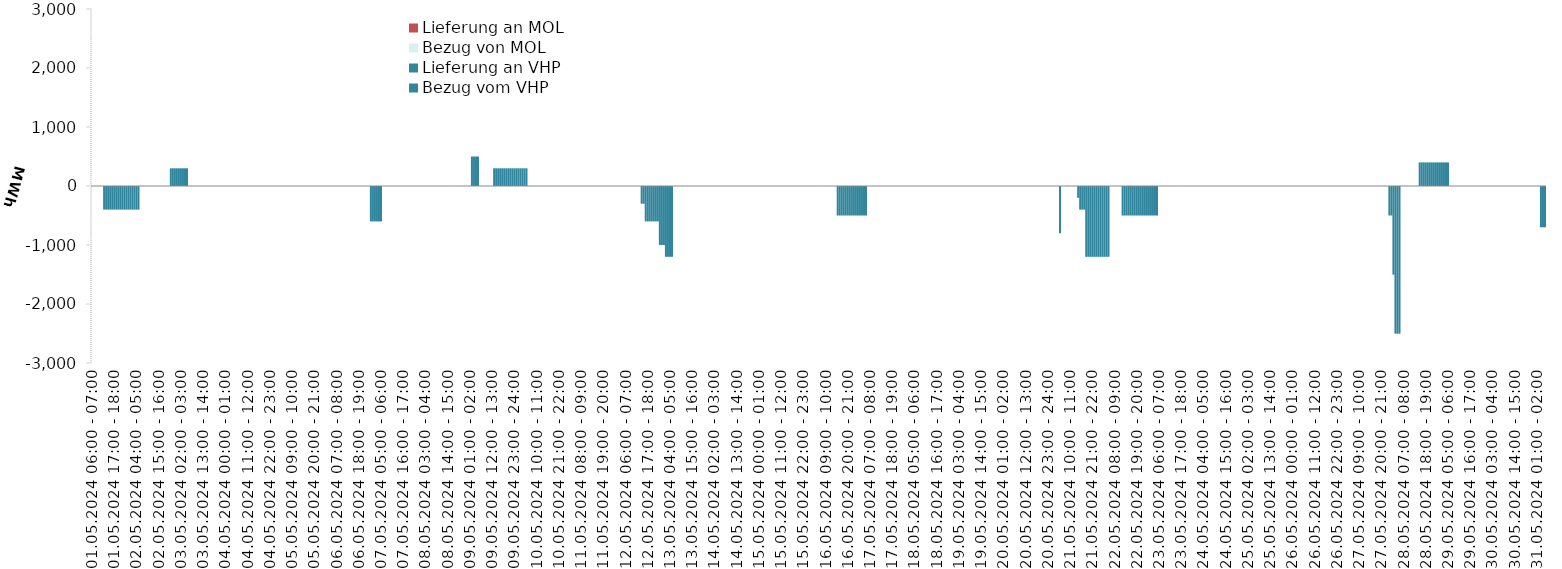
| Category | Bezug vom VHP | Lieferung an VHP | Bezug von MOL | Lieferung an MOL |
|---|---|---|---|---|
| 01.05.2024 06:00 - 07:00 | 0 | 0 | 0 | 0 |
| 01.05.2024 07:00 - 08:00 | 0 | 0 | 0 | 0 |
| 01.05.2024 08:00 - 09:00 | 0 | 0 | 0 | 0 |
| 01.05.2024 09:00 - 10:00 | 0 | 0 | 0 | 0 |
| 01.05.2024 10:00 - 11:00 | 0 | 0 | 0 | 0 |
| 01.05.2024 11:00 - 12:00 | 0 | 0 | 0 | 0 |
| 01.05.2024 12:00 - 13:00 | 0 | -400 | 0 | 0 |
| 01.05.2024 13:00 - 14:00 | 0 | -400 | 0 | 0 |
| 01.05.2024 14:00 - 15:00 | 0 | -400 | 0 | 0 |
| 01.05.2024 15:00 - 16:00 | 0 | -400 | 0 | 0 |
| 01.05.2024 16:00 - 17:00 | 0 | -400 | 0 | 0 |
| 01.05.2024 17:00 - 18:00 | 0 | -400 | 0 | 0 |
| 01.05.2024 18:00 - 19:00 | 0 | -400 | 0 | 0 |
| 01.05.2024 19:00 - 20:00 | 0 | -400 | 0 | 0 |
| 01.05.2024 20:00 - 21:00 | 0 | -400 | 0 | 0 |
| 01.05.2024 21:00 - 22:00 | 0 | -400 | 0 | 0 |
| 01.05.2024 22:00 - 23:00 | 0 | -400 | 0 | 0 |
| 01.05.2024 23:00 - 24:00 | 0 | -400 | 0 | 0 |
| 02.05.2024 00:00 - 01:00 | 0 | -400 | 0 | 0 |
| 02.05.2024 01:00 - 02:00 | 0 | -400 | 0 | 0 |
| 02.05.2024 02:00 - 03:00 | 0 | -400 | 0 | 0 |
| 02.05.2024 03:00 - 04:00 | 0 | -400 | 0 | 0 |
| 02.05.2024 04:00 - 05:00 | 0 | -400 | 0 | 0 |
| 02.05.2024 05:00 - 06:00 | 0 | -400 | 0 | 0 |
| 02.05.2024 06:00 - 07:00 | 0 | 0 | 0 | 0 |
| 02.05.2024 07:00 - 08:00 | 0 | 0 | 0 | 0 |
| 02.05.2024 08:00 - 09:00 | 0 | 0 | 0 | 0 |
| 02.05.2024 09:00 - 10:00 | 0 | 0 | 0 | 0 |
| 02.05.2024 10:00 - 11:00 | 0 | 0 | 0 | 0 |
| 02.05.2024 11:00 - 12:00 | 0 | 0 | 0 | 0 |
| 02.05.2024 12:00 - 13:00 | 0 | 0 | 0 | 0 |
| 02.05.2024 13:00 - 14:00 | 0 | 0 | 0 | 0 |
| 02.05.2024 14:00 - 15:00 | 0 | 0 | 0 | 0 |
| 02.05.2024 15:00 - 16:00 | 0 | 0 | 0 | 0 |
| 02.05.2024 16:00 - 17:00 | 0 | 0 | 0 | 0 |
| 02.05.2024 17:00 - 18:00 | 0 | 0 | 0 | 0 |
| 02.05.2024 18:00 - 19:00 | 0 | 0 | 0 | 0 |
| 02.05.2024 19:00 - 20:00 | 0 | 0 | 0 | 0 |
| 02.05.2024 20:00 - 21:00 | 0 | 0 | 0 | 0 |
| 02.05.2024 21:00 - 22:00 | 300 | 0 | 0 | 0 |
| 02.05.2024 22:00 - 23:00 | 300 | 0 | 0 | 0 |
| 02.05.2024 23:00 - 24:00 | 300 | 0 | 0 | 0 |
| 03.05.2024 00:00 - 01:00 | 300 | 0 | 0 | 0 |
| 03.05.2024 01:00 - 02:00 | 300 | 0 | 0 | 0 |
| 03.05.2024 02:00 - 03:00 | 300 | 0 | 0 | 0 |
| 03.05.2024 03:00 - 04:00 | 300 | 0 | 0 | 0 |
| 03.05.2024 04:00 - 05:00 | 300 | 0 | 0 | 0 |
| 03.05.2024 05:00 - 06:00 | 300 | 0 | 0 | 0 |
| 03.05.2024 06:00 - 07:00 | 0 | 0 | 0 | 0 |
| 03.05.2024 07:00 - 08:00 | 0 | 0 | 0 | 0 |
| 03.05.2024 08:00 - 09:00 | 0 | 0 | 0 | 0 |
| 03.05.2024 09:00 - 10:00 | 0 | 0 | 0 | 0 |
| 03.05.2024 10:00 - 11:00 | 0 | 0 | 0 | 0 |
| 03.05.2024 11:00 - 12:00 | 0 | 0 | 0 | 0 |
| 03.05.2024 12:00 - 13:00 | 0 | 0 | 0 | 0 |
| 03.05.2024 13:00 - 14:00 | 0 | 0 | 0 | 0 |
| 03.05.2024 14:00 - 15:00 | 0 | 0 | 0 | 0 |
| 03.05.2024 15:00 - 16:00 | 0 | 0 | 0 | 0 |
| 03.05.2024 16:00 - 17:00 | 0 | 0 | 0 | 0 |
| 03.05.2024 17:00 - 18:00 | 0 | 0 | 0 | 0 |
| 03.05.2024 18:00 - 19:00 | 0 | 0 | 0 | 0 |
| 03.05.2024 19:00 - 20:00 | 0 | 0 | 0 | 0 |
| 03.05.2024 20:00 - 21:00 | 0 | 0 | 0 | 0 |
| 03.05.2024 21:00 - 22:00 | 0 | 0 | 0 | 0 |
| 03.05.2024 22:00 - 23:00 | 0 | 0 | 0 | 0 |
| 03.05.2024 23:00 - 24:00 | 0 | 0 | 0 | 0 |
| 04.05.2024 00:00 - 01:00 | 0 | 0 | 0 | 0 |
| 04.05.2024 01:00 - 02:00 | 0 | 0 | 0 | 0 |
| 04.05.2024 02:00 - 03:00 | 0 | 0 | 0 | 0 |
| 04.05.2024 03:00 - 04:00 | 0 | 0 | 0 | 0 |
| 04.05.2024 04:00 - 05:00 | 0 | 0 | 0 | 0 |
| 04.05.2024 05:00 - 06:00 | 0 | 0 | 0 | 0 |
| 04.05.2024 06:00 - 07:00 | 0 | 0 | 0 | 0 |
| 04.05.2024 07:00 - 08:00 | 0 | 0 | 0 | 0 |
| 04.05.2024 08:00 - 09:00 | 0 | 0 | 0 | 0 |
| 04.05.2024 09:00 - 10:00 | 0 | 0 | 0 | 0 |
| 04.05.2024 10:00 - 11:00 | 0 | 0 | 0 | 0 |
| 04.05.2024 11:00 - 12:00 | 0 | 0 | 0 | 0 |
| 04.05.2024 12:00 - 13:00 | 0 | 0 | 0 | 0 |
| 04.05.2024 13:00 - 14:00 | 0 | 0 | 0 | 0 |
| 04.05.2024 14:00 - 15:00 | 0 | 0 | 0 | 0 |
| 04.05.2024 15:00 - 16:00 | 0 | 0 | 0 | 0 |
| 04.05.2024 16:00 - 17:00 | 0 | 0 | 0 | 0 |
| 04.05.2024 17:00 - 18:00 | 0 | 0 | 0 | 0 |
| 04.05.2024 18:00 - 19:00 | 0 | 0 | 0 | 0 |
| 04.05.2024 19:00 - 20:00 | 0 | 0 | 0 | 0 |
| 04.05.2024 20:00 - 21:00 | 0 | 0 | 0 | 0 |
| 04.05.2024 21:00 - 22:00 | 0 | 0 | 0 | 0 |
| 04.05.2024 22:00 - 23:00 | 0 | 0 | 0 | 0 |
| 04.05.2024 23:00 - 24:00 | 0 | 0 | 0 | 0 |
| 05.05.2024 00:00 - 01:00 | 0 | 0 | 0 | 0 |
| 05.05.2024 01:00 - 02:00 | 0 | 0 | 0 | 0 |
| 05.05.2024 02:00 - 03:00 | 0 | 0 | 0 | 0 |
| 05.05.2024 03:00 - 04:00 | 0 | 0 | 0 | 0 |
| 05.05.2024 04:00 - 05:00 | 0 | 0 | 0 | 0 |
| 05.05.2024 05:00 - 06:00 | 0 | 0 | 0 | 0 |
| 05.05.2024 06:00 - 07:00 | 0 | 0 | 0 | 0 |
| 05.05.2024 07:00 - 08:00 | 0 | 0 | 0 | 0 |
| 05.05.2024 08:00 - 09:00 | 0 | 0 | 0 | 0 |
| 05.05.2024 09:00 - 10:00 | 0 | 0 | 0 | 0 |
| 05.05.2024 10:00 - 11:00 | 0 | 0 | 0 | 0 |
| 05.05.2024 11:00 - 12:00 | 0 | 0 | 0 | 0 |
| 05.05.2024 12:00 - 13:00 | 0 | 0 | 0 | 0 |
| 05.05.2024 13:00 - 14:00 | 0 | 0 | 0 | 0 |
| 05.05.2024 14:00 - 15:00 | 0 | 0 | 0 | 0 |
| 05.05.2024 15:00 - 16:00 | 0 | 0 | 0 | 0 |
| 05.05.2024 16:00 - 17:00 | 0 | 0 | 0 | 0 |
| 05.05.2024 17:00 - 18:00 | 0 | 0 | 0 | 0 |
| 05.05.2024 18:00 - 19:00 | 0 | 0 | 0 | 0 |
| 05.05.2024 19:00 - 20:00 | 0 | 0 | 0 | 0 |
| 05.05.2024 20:00 - 21:00 | 0 | 0 | 0 | 0 |
| 05.05.2024 21:00 - 22:00 | 0 | 0 | 0 | 0 |
| 05.05.2024 22:00 - 23:00 | 0 | 0 | 0 | 0 |
| 05.05.2024 23:00 - 24:00 | 0 | 0 | 0 | 0 |
| 06.05.2024 00:00 - 01:00 | 0 | 0 | 0 | 0 |
| 06.05.2024 01:00 - 02:00 | 0 | 0 | 0 | 0 |
| 06.05.2024 02:00 - 03:00 | 0 | 0 | 0 | 0 |
| 06.05.2024 03:00 - 04:00 | 0 | 0 | 0 | 0 |
| 06.05.2024 04:00 - 05:00 | 0 | 0 | 0 | 0 |
| 06.05.2024 05:00 - 06:00 | 0 | 0 | 0 | 0 |
| 06.05.2024 06:00 - 07:00 | 0 | 0 | 0 | 0 |
| 06.05.2024 07:00 - 08:00 | 0 | 0 | 0 | 0 |
| 06.05.2024 08:00 - 09:00 | 0 | 0 | 0 | 0 |
| 06.05.2024 09:00 - 10:00 | 0 | 0 | 0 | 0 |
| 06.05.2024 10:00 - 11:00 | 0 | 0 | 0 | 0 |
| 06.05.2024 11:00 - 12:00 | 0 | 0 | 0 | 0 |
| 06.05.2024 12:00 - 13:00 | 0 | 0 | 0 | 0 |
| 06.05.2024 13:00 - 14:00 | 0 | 0 | 0 | 0 |
| 06.05.2024 14:00 - 15:00 | 0 | 0 | 0 | 0 |
| 06.05.2024 15:00 - 16:00 | 0 | 0 | 0 | 0 |
| 06.05.2024 16:00 - 17:00 | 0 | 0 | 0 | 0 |
| 06.05.2024 17:00 - 18:00 | 0 | 0 | 0 | 0 |
| 06.05.2024 18:00 - 19:00 | 0 | 0 | 0 | 0 |
| 06.05.2024 19:00 - 20:00 | 0 | 0 | 0 | 0 |
| 06.05.2024 20:00 - 21:00 | 0 | 0 | 0 | 0 |
| 06.05.2024 21:00 - 22:00 | 0 | 0 | 0 | 0 |
| 06.05.2024 22:00 - 23:00 | 0 | 0 | 0 | 0 |
| 06.05.2024 23:00 - 24:00 | 0 | 0 | 0 | 0 |
| 07.05.2024 00:00 - 01:00 | 0 | -600 | 0 | 0 |
| 07.05.2024 01:00 - 02:00 | 0 | -600 | 0 | 0 |
| 07.05.2024 02:00 - 03:00 | 0 | -600 | 0 | 0 |
| 07.05.2024 03:00 - 04:00 | 0 | -600 | 0 | 0 |
| 07.05.2024 04:00 - 05:00 | 0 | -600 | 0 | 0 |
| 07.05.2024 05:00 - 06:00 | 0 | -600 | 0 | 0 |
| 07.05.2024 06:00 - 07:00 | 0 | 0 | 0 | 0 |
| 07.05.2024 07:00 - 08:00 | 0 | 0 | 0 | 0 |
| 07.05.2024 08:00 - 09:00 | 0 | 0 | 0 | 0 |
| 07.05.2024 09:00 - 10:00 | 0 | 0 | 0 | 0 |
| 07.05.2024 10:00 - 11:00 | 0 | 0 | 0 | 0 |
| 07.05.2024 11:00 - 12:00 | 0 | 0 | 0 | 0 |
| 07.05.2024 12:00 - 13:00 | 0 | 0 | 0 | 0 |
| 07.05.2024 13:00 - 14:00 | 0 | 0 | 0 | 0 |
| 07.05.2024 14:00 - 15:00 | 0 | 0 | 0 | 0 |
| 07.05.2024 15:00 - 16:00 | 0 | 0 | 0 | 0 |
| 07.05.2024 16:00 - 17:00 | 0 | 0 | 0 | 0 |
| 07.05.2024 17:00 - 18:00 | 0 | 0 | 0 | 0 |
| 07.05.2024 18:00 - 19:00 | 0 | 0 | 0 | 0 |
| 07.05.2024 19:00 - 20:00 | 0 | 0 | 0 | 0 |
| 07.05.2024 20:00 - 21:00 | 0 | 0 | 0 | 0 |
| 07.05.2024 21:00 - 22:00 | 0 | 0 | 0 | 0 |
| 07.05.2024 22:00 - 23:00 | 0 | 0 | 0 | 0 |
| 07.05.2024 23:00 - 24:00 | 0 | 0 | 0 | 0 |
| 08.05.2024 00:00 - 01:00 | 0 | 0 | 0 | 0 |
| 08.05.2024 01:00 - 02:00 | 0 | 0 | 0 | 0 |
| 08.05.2024 02:00 - 03:00 | 0 | 0 | 0 | 0 |
| 08.05.2024 03:00 - 04:00 | 0 | 0 | 0 | 0 |
| 08.05.2024 04:00 - 05:00 | 0 | 0 | 0 | 0 |
| 08.05.2024 05:00 - 06:00 | 0 | 0 | 0 | 0 |
| 08.05.2024 06:00 - 07:00 | 0 | 0 | 0 | 0 |
| 08.05.2024 07:00 - 08:00 | 0 | 0 | 0 | 0 |
| 08.05.2024 08:00 - 09:00 | 0 | 0 | 0 | 0 |
| 08.05.2024 09:00 - 10:00 | 0 | 0 | 0 | 0 |
| 08.05.2024 10:00 - 11:00 | 0 | 0 | 0 | 0 |
| 08.05.2024 11:00 - 12:00 | 0 | 0 | 0 | 0 |
| 08.05.2024 12:00 - 13:00 | 0 | 0 | 0 | 0 |
| 08.05.2024 13:00 - 14:00 | 0 | 0 | 0 | 0 |
| 08.05.2024 14:00 - 15:00 | 0 | 0 | 0 | 0 |
| 08.05.2024 15:00 - 16:00 | 0 | 0 | 0 | 0 |
| 08.05.2024 16:00 - 17:00 | 0 | 0 | 0 | 0 |
| 08.05.2024 17:00 - 18:00 | 0 | 0 | 0 | 0 |
| 08.05.2024 18:00 - 19:00 | 0 | 0 | 0 | 0 |
| 08.05.2024 19:00 - 20:00 | 0 | 0 | 0 | 0 |
| 08.05.2024 20:00 - 21:00 | 0 | 0 | 0 | 0 |
| 08.05.2024 21:00 - 22:00 | 0 | 0 | 0 | 0 |
| 08.05.2024 22:00 - 23:00 | 0 | 0 | 0 | 0 |
| 08.05.2024 23:00 - 24:00 | 0 | 0 | 0 | 0 |
| 09.05.2024 00:00 - 01:00 | 0 | 0 | 0 | 0 |
| 09.05.2024 01:00 - 02:00 | 0 | 0 | 0 | 0 |
| 09.05.2024 02:00 - 03:00 | 500 | 0 | 0 | 0 |
| 09.05.2024 03:00 - 04:00 | 500 | 0 | 0 | 0 |
| 09.05.2024 04:00 - 05:00 | 500 | 0 | 0 | 0 |
| 09.05.2024 05:00 - 06:00 | 500 | 0 | 0 | 0 |
| 09.05.2024 06:00 - 07:00 | 0 | 0 | 0 | 0 |
| 09.05.2024 07:00 - 08:00 | 0 | 0 | 0 | 0 |
| 09.05.2024 08:00 - 09:00 | 0 | 0 | 0 | 0 |
| 09.05.2024 09:00 - 10:00 | 0 | 0 | 0 | 0 |
| 09.05.2024 10:00 - 11:00 | 0 | 0 | 0 | 0 |
| 09.05.2024 11:00 - 12:00 | 0 | 0 | 0 | 0 |
| 09.05.2024 12:00 - 13:00 | 0 | 0 | 0 | 0 |
| 09.05.2024 13:00 - 14:00 | 300 | 0 | 0 | 0 |
| 09.05.2024 14:00 - 15:00 | 300 | 0 | 0 | 0 |
| 09.05.2024 15:00 - 16:00 | 300 | 0 | 0 | 0 |
| 09.05.2024 16:00 - 17:00 | 300 | 0 | 0 | 0 |
| 09.05.2024 17:00 - 18:00 | 300 | 0 | 0 | 0 |
| 09.05.2024 18:00 - 19:00 | 300 | 0 | 0 | 0 |
| 09.05.2024 19:00 - 20:00 | 300 | 0 | 0 | 0 |
| 09.05.2024 20:00 - 21:00 | 300 | 0 | 0 | 0 |
| 09.05.2024 21:00 - 22:00 | 300 | 0 | 0 | 0 |
| 09.05.2024 22:00 - 23:00 | 300 | 0 | 0 | 0 |
| 09.05.2024 23:00 - 24:00 | 300 | 0 | 0 | 0 |
| 10.05.2024 00:00 - 01:00 | 300 | 0 | 0 | 0 |
| 10.05.2024 01:00 - 02:00 | 300 | 0 | 0 | 0 |
| 10.05.2024 02:00 - 03:00 | 300 | 0 | 0 | 0 |
| 10.05.2024 03:00 - 04:00 | 300 | 0 | 0 | 0 |
| 10.05.2024 04:00 - 05:00 | 300 | 0 | 0 | 0 |
| 10.05.2024 05:00 - 06:00 | 300 | 0 | 0 | 0 |
| 10.05.2024 06:00 - 07:00 | 0 | 0 | 0 | 0 |
| 10.05.2024 07:00 - 08:00 | 0 | 0 | 0 | 0 |
| 10.05.2024 08:00 - 09:00 | 0 | 0 | 0 | 0 |
| 10.05.2024 09:00 - 10:00 | 0 | 0 | 0 | 0 |
| 10.05.2024 10:00 - 11:00 | 0 | 0 | 0 | 0 |
| 10.05.2024 11:00 - 12:00 | 0 | 0 | 0 | 0 |
| 10.05.2024 12:00 - 13:00 | 0 | 0 | 0 | 0 |
| 10.05.2024 13:00 - 14:00 | 0 | 0 | 0 | 0 |
| 10.05.2024 14:00 - 15:00 | 0 | 0 | 0 | 0 |
| 10.05.2024 15:00 - 16:00 | 0 | 0 | 0 | 0 |
| 10.05.2024 16:00 - 17:00 | 0 | 0 | 0 | 0 |
| 10.05.2024 17:00 - 18:00 | 0 | 0 | 0 | 0 |
| 10.05.2024 18:00 - 19:00 | 0 | 0 | 0 | 0 |
| 10.05.2024 19:00 - 20:00 | 0 | 0 | 0 | 0 |
| 10.05.2024 20:00 - 21:00 | 0 | 0 | 0 | 0 |
| 10.05.2024 21:00 - 22:00 | 0 | 0 | 0 | 0 |
| 10.05.2024 22:00 - 23:00 | 0 | 0 | 0 | 0 |
| 10.05.2024 23:00 - 24:00 | 0 | 0 | 0 | 0 |
| 11.05.2024 00:00 - 01:00 | 0 | 0 | 0 | 0 |
| 11.05.2024 01:00 - 02:00 | 0 | 0 | 0 | 0 |
| 11.05.2024 02:00 - 03:00 | 0 | 0 | 0 | 0 |
| 11.05.2024 03:00 - 04:00 | 0 | 0 | 0 | 0 |
| 11.05.2024 04:00 - 05:00 | 0 | 0 | 0 | 0 |
| 11.05.2024 05:00 - 06:00 | 0 | 0 | 0 | 0 |
| 11.05.2024 06:00 - 07:00 | 0 | 0 | 0 | 0 |
| 11.05.2024 07:00 - 08:00 | 0 | 0 | 0 | 0 |
| 11.05.2024 08:00 - 09:00 | 0 | 0 | 0 | 0 |
| 11.05.2024 09:00 - 10:00 | 0 | 0 | 0 | 0 |
| 11.05.2024 10:00 - 11:00 | 0 | 0 | 0 | 0 |
| 11.05.2024 11:00 - 12:00 | 0 | 0 | 0 | 0 |
| 11.05.2024 12:00 - 13:00 | 0 | 0 | 0 | 0 |
| 11.05.2024 13:00 - 14:00 | 0 | 0 | 0 | 0 |
| 11.05.2024 14:00 - 15:00 | 0 | 0 | 0 | 0 |
| 11.05.2024 15:00 - 16:00 | 0 | 0 | 0 | 0 |
| 11.05.2024 16:00 - 17:00 | 0 | 0 | 0 | 0 |
| 11.05.2024 17:00 - 18:00 | 0 | 0 | 0 | 0 |
| 11.05.2024 18:00 - 19:00 | 0 | 0 | 0 | 0 |
| 11.05.2024 19:00 - 20:00 | 0 | 0 | 0 | 0 |
| 11.05.2024 20:00 - 21:00 | 0 | 0 | 0 | 0 |
| 11.05.2024 21:00 - 22:00 | 0 | 0 | 0 | 0 |
| 11.05.2024 22:00 - 23:00 | 0 | 0 | 0 | 0 |
| 11.05.2024 23:00 - 24:00 | 0 | 0 | 0 | 0 |
| 12.05.2024 00:00 - 01:00 | 0 | 0 | 0 | 0 |
| 12.05.2024 01:00 - 02:00 | 0 | 0 | 0 | 0 |
| 12.05.2024 02:00 - 03:00 | 0 | 0 | 0 | 0 |
| 12.05.2024 03:00 - 04:00 | 0 | 0 | 0 | 0 |
| 12.05.2024 04:00 - 05:00 | 0 | 0 | 0 | 0 |
| 12.05.2024 05:00 - 06:00 | 0 | 0 | 0 | 0 |
| 12.05.2024 06:00 - 07:00 | 0 | 0 | 0 | 0 |
| 12.05.2024 07:00 - 08:00 | 0 | 0 | 0 | 0 |
| 12.05.2024 08:00 - 09:00 | 0 | 0 | 0 | 0 |
| 12.05.2024 09:00 - 10:00 | 0 | 0 | 0 | 0 |
| 12.05.2024 10:00 - 11:00 | 0 | 0 | 0 | 0 |
| 12.05.2024 11:00 - 12:00 | 0 | 0 | 0 | 0 |
| 12.05.2024 12:00 - 13:00 | 0 | 0 | 0 | 0 |
| 12.05.2024 13:00 - 14:00 | 0 | 0 | 0 | 0 |
| 12.05.2024 14:00 - 15:00 | 0 | -300 | 0 | 0 |
| 12.05.2024 15:00 - 16:00 | 0 | -300 | 0 | 0 |
| 12.05.2024 16:00 - 17:00 | 0 | -600 | 0 | 0 |
| 12.05.2024 17:00 - 18:00 | 0 | -600 | 0 | 0 |
| 12.05.2024 18:00 - 19:00 | 0 | -600 | 0 | 0 |
| 12.05.2024 19:00 - 20:00 | 0 | -600 | 0 | 0 |
| 12.05.2024 20:00 - 21:00 | 0 | -600 | 0 | 0 |
| 12.05.2024 21:00 - 22:00 | 0 | -600 | 0 | 0 |
| 12.05.2024 22:00 - 23:00 | 0 | -600 | 0 | 0 |
| 12.05.2024 23:00 - 24:00 | 0 | -1000 | 0 | 0 |
| 13.05.2024 00:00 - 01:00 | 0 | -1000 | 0 | 0 |
| 13.05.2024 01:00 - 02:00 | 0 | -1000 | 0 | 0 |
| 13.05.2024 02:00 - 03:00 | 0 | -1200 | 0 | 0 |
| 13.05.2024 03:00 - 04:00 | 0 | -1200 | 0 | 0 |
| 13.05.2024 04:00 - 05:00 | 0 | -1200 | 0 | 0 |
| 13.05.2024 05:00 - 06:00 | 0 | -1200 | 0 | 0 |
| 13.05.2024 06:00 - 07:00 | 0 | 0 | 0 | 0 |
| 13.05.2024 07:00 - 08:00 | 0 | 0 | 0 | 0 |
| 13.05.2024 08:00 - 09:00 | 0 | 0 | 0 | 0 |
| 13.05.2024 09:00 - 10:00 | 0 | 0 | 0 | 0 |
| 13.05.2024 10:00 - 11:00 | 0 | 0 | 0 | 0 |
| 13.05.2024 11:00 - 12:00 | 0 | 0 | 0 | 0 |
| 13.05.2024 12:00 - 13:00 | 0 | 0 | 0 | 0 |
| 13.05.2024 13:00 - 14:00 | 0 | 0 | 0 | 0 |
| 13.05.2024 14:00 - 15:00 | 0 | 0 | 0 | 0 |
| 13.05.2024 15:00 - 16:00 | 0 | 0 | 0 | 0 |
| 13.05.2024 16:00 - 17:00 | 0 | 0 | 0 | 0 |
| 13.05.2024 17:00 - 18:00 | 0 | 0 | 0 | 0 |
| 13.05.2024 18:00 - 19:00 | 0 | 0 | 0 | 0 |
| 13.05.2024 19:00 - 20:00 | 0 | 0 | 0 | 0 |
| 13.05.2024 20:00 - 21:00 | 0 | 0 | 0 | 0 |
| 13.05.2024 21:00 - 22:00 | 0 | 0 | 0 | 0 |
| 13.05.2024 22:00 - 23:00 | 0 | 0 | 0 | 0 |
| 13.05.2024 23:00 - 24:00 | 0 | 0 | 0 | 0 |
| 14.05.2024 00:00 - 01:00 | 0 | 0 | 0 | 0 |
| 14.05.2024 01:00 - 02:00 | 0 | 0 | 0 | 0 |
| 14.05.2024 02:00 - 03:00 | 0 | 0 | 0 | 0 |
| 14.05.2024 03:00 - 04:00 | 0 | 0 | 0 | 0 |
| 14.05.2024 04:00 - 05:00 | 0 | 0 | 0 | 0 |
| 14.05.2024 05:00 - 06:00 | 0 | 0 | 0 | 0 |
| 14.05.2024 06:00 - 07:00 | 0 | 0 | 0 | 0 |
| 14.05.2024 07:00 - 08:00 | 0 | 0 | 0 | 0 |
| 14.05.2024 08:00 - 09:00 | 0 | 0 | 0 | 0 |
| 14.05.2024 09:00 - 10:00 | 0 | 0 | 0 | 0 |
| 14.05.2024 10:00 - 11:00 | 0 | 0 | 0 | 0 |
| 14.05.2024 11:00 - 12:00 | 0 | 0 | 0 | 0 |
| 14.05.2024 12:00 - 13:00 | 0 | 0 | 0 | 0 |
| 14.05.2024 13:00 - 14:00 | 0 | 0 | 0 | 0 |
| 14.05.2024 14:00 - 15:00 | 0 | 0 | 0 | 0 |
| 14.05.2024 15:00 - 16:00 | 0 | 0 | 0 | 0 |
| 14.05.2024 16:00 - 17:00 | 0 | 0 | 0 | 0 |
| 14.05.2024 17:00 - 18:00 | 0 | 0 | 0 | 0 |
| 14.05.2024 18:00 - 19:00 | 0 | 0 | 0 | 0 |
| 14.05.2024 19:00 - 20:00 | 0 | 0 | 0 | 0 |
| 14.05.2024 20:00 - 21:00 | 0 | 0 | 0 | 0 |
| 14.05.2024 21:00 - 22:00 | 0 | 0 | 0 | 0 |
| 14.05.2024 22:00 - 23:00 | 0 | 0 | 0 | 0 |
| 14.05.2024 23:00 - 24:00 | 0 | 0 | 0 | 0 |
| 15.05.2024 00:00 - 01:00 | 0 | 0 | 0 | 0 |
| 15.05.2024 01:00 - 02:00 | 0 | 0 | 0 | 0 |
| 15.05.2024 02:00 - 03:00 | 0 | 0 | 0 | 0 |
| 15.05.2024 03:00 - 04:00 | 0 | 0 | 0 | 0 |
| 15.05.2024 04:00 - 05:00 | 0 | 0 | 0 | 0 |
| 15.05.2024 05:00 - 06:00 | 0 | 0 | 0 | 0 |
| 15.05.2024 06:00 - 07:00 | 0 | 0 | 0 | 0 |
| 15.05.2024 07:00 - 08:00 | 0 | 0 | 0 | 0 |
| 15.05.2024 08:00 - 09:00 | 0 | 0 | 0 | 0 |
| 15.05.2024 09:00 - 10:00 | 0 | 0 | 0 | 0 |
| 15.05.2024 10:00 - 11:00 | 0 | 0 | 0 | 0 |
| 15.05.2024 11:00 - 12:00 | 0 | 0 | 0 | 0 |
| 15.05.2024 12:00 - 13:00 | 0 | 0 | 0 | 0 |
| 15.05.2024 13:00 - 14:00 | 0 | 0 | 0 | 0 |
| 15.05.2024 14:00 - 15:00 | 0 | 0 | 0 | 0 |
| 15.05.2024 15:00 - 16:00 | 0 | 0 | 0 | 0 |
| 15.05.2024 16:00 - 17:00 | 0 | 0 | 0 | 0 |
| 15.05.2024 17:00 - 18:00 | 0 | 0 | 0 | 0 |
| 15.05.2024 18:00 - 19:00 | 0 | 0 | 0 | 0 |
| 15.05.2024 19:00 - 20:00 | 0 | 0 | 0 | 0 |
| 15.05.2024 20:00 - 21:00 | 0 | 0 | 0 | 0 |
| 15.05.2024 21:00 - 22:00 | 0 | 0 | 0 | 0 |
| 15.05.2024 22:00 - 23:00 | 0 | 0 | 0 | 0 |
| 15.05.2024 23:00 - 24:00 | 0 | 0 | 0 | 0 |
| 16.05.2024 00:00 - 01:00 | 0 | 0 | 0 | 0 |
| 16.05.2024 01:00 - 02:00 | 0 | 0 | 0 | 0 |
| 16.05.2024 02:00 - 03:00 | 0 | 0 | 0 | 0 |
| 16.05.2024 03:00 - 04:00 | 0 | 0 | 0 | 0 |
| 16.05.2024 04:00 - 05:00 | 0 | 0 | 0 | 0 |
| 16.05.2024 05:00 - 06:00 | 0 | 0 | 0 | 0 |
| 16.05.2024 06:00 - 07:00 | 0 | 0 | 0 | 0 |
| 16.05.2024 07:00 - 08:00 | 0 | 0 | 0 | 0 |
| 16.05.2024 08:00 - 09:00 | 0 | 0 | 0 | 0 |
| 16.05.2024 09:00 - 10:00 | 0 | 0 | 0 | 0 |
| 16.05.2024 10:00 - 11:00 | 0 | 0 | 0 | 0 |
| 16.05.2024 11:00 - 12:00 | 0 | 0 | 0 | 0 |
| 16.05.2024 12:00 - 13:00 | 0 | 0 | 0 | 0 |
| 16.05.2024 13:00 - 14:00 | 0 | 0 | 0 | 0 |
| 16.05.2024 14:00 - 15:00 | 0 | 0 | 0 | 0 |
| 16.05.2024 15:00 - 16:00 | 0 | -500 | 0 | 0 |
| 16.05.2024 16:00 - 17:00 | 0 | -500 | 0 | 0 |
| 16.05.2024 17:00 - 18:00 | 0 | -500 | 0 | 0 |
| 16.05.2024 18:00 - 19:00 | 0 | -500 | 0 | 0 |
| 16.05.2024 19:00 - 20:00 | 0 | -500 | 0 | 0 |
| 16.05.2024 20:00 - 21:00 | 0 | -500 | 0 | 0 |
| 16.05.2024 21:00 - 22:00 | 0 | -500 | 0 | 0 |
| 16.05.2024 22:00 - 23:00 | 0 | -500 | 0 | 0 |
| 16.05.2024 23:00 - 24:00 | 0 | -500 | 0 | 0 |
| 17.05.2024 00:00 - 01:00 | 0 | -500 | 0 | 0 |
| 17.05.2024 01:00 - 02:00 | 0 | -500 | 0 | 0 |
| 17.05.2024 02:00 - 03:00 | 0 | -500 | 0 | 0 |
| 17.05.2024 03:00 - 04:00 | 0 | -500 | 0 | 0 |
| 17.05.2024 04:00 - 05:00 | 0 | -500 | 0 | 0 |
| 17.05.2024 05:00 - 06:00 | 0 | -500 | 0 | 0 |
| 17.05.2024 06:00 - 07:00 | 0 | 0 | 0 | 0 |
| 17.05.2024 07:00 - 08:00 | 0 | 0 | 0 | 0 |
| 17.05.2024 08:00 - 09:00 | 0 | 0 | 0 | 0 |
| 17.05.2024 09:00 - 10:00 | 0 | 0 | 0 | 0 |
| 17.05.2024 10:00 - 11:00 | 0 | 0 | 0 | 0 |
| 17.05.2024 11:00 - 12:00 | 0 | 0 | 0 | 0 |
| 17.05.2024 12:00 - 13:00 | 0 | 0 | 0 | 0 |
| 17.05.2024 13:00 - 14:00 | 0 | 0 | 0 | 0 |
| 17.05.2024 14:00 - 15:00 | 0 | 0 | 0 | 0 |
| 17.05.2024 15:00 - 16:00 | 0 | 0 | 0 | 0 |
| 17.05.2024 16:00 - 17:00 | 0 | 0 | 0 | 0 |
| 17.05.2024 17:00 - 18:00 | 0 | 0 | 0 | 0 |
| 17.05.2024 18:00 - 19:00 | 0 | 0 | 0 | 0 |
| 17.05.2024 19:00 - 20:00 | 0 | 0 | 0 | 0 |
| 17.05.2024 20:00 - 21:00 | 0 | 0 | 0 | 0 |
| 17.05.2024 21:00 - 22:00 | 0 | 0 | 0 | 0 |
| 17.05.2024 22:00 - 23:00 | 0 | 0 | 0 | 0 |
| 17.05.2024 23:00 - 24:00 | 0 | 0 | 0 | 0 |
| 18.05.2024 00:00 - 01:00 | 0 | 0 | 0 | 0 |
| 18.05.2024 01:00 - 02:00 | 0 | 0 | 0 | 0 |
| 18.05.2024 02:00 - 03:00 | 0 | 0 | 0 | 0 |
| 18.05.2024 03:00 - 04:00 | 0 | 0 | 0 | 0 |
| 18.05.2024 04:00 - 05:00 | 0 | 0 | 0 | 0 |
| 18.05.2024 05:00 - 06:00 | 0 | 0 | 0 | 0 |
| 18.05.2024 06:00 - 07:00 | 0 | 0 | 0 | 0 |
| 18.05.2024 07:00 - 08:00 | 0 | 0 | 0 | 0 |
| 18.05.2024 08:00 - 09:00 | 0 | 0 | 0 | 0 |
| 18.05.2024 09:00 - 10:00 | 0 | 0 | 0 | 0 |
| 18.05.2024 10:00 - 11:00 | 0 | 0 | 0 | 0 |
| 18.05.2024 11:00 - 12:00 | 0 | 0 | 0 | 0 |
| 18.05.2024 12:00 - 13:00 | 0 | 0 | 0 | 0 |
| 18.05.2024 13:00 - 14:00 | 0 | 0 | 0 | 0 |
| 18.05.2024 14:00 - 15:00 | 0 | 0 | 0 | 0 |
| 18.05.2024 15:00 - 16:00 | 0 | 0 | 0 | 0 |
| 18.05.2024 16:00 - 17:00 | 0 | 0 | 0 | 0 |
| 18.05.2024 17:00 - 18:00 | 0 | 0 | 0 | 0 |
| 18.05.2024 18:00 - 19:00 | 0 | 0 | 0 | 0 |
| 18.05.2024 19:00 - 20:00 | 0 | 0 | 0 | 0 |
| 18.05.2024 20:00 - 21:00 | 0 | 0 | 0 | 0 |
| 18.05.2024 21:00 - 22:00 | 0 | 0 | 0 | 0 |
| 18.05.2024 22:00 - 23:00 | 0 | 0 | 0 | 0 |
| 18.05.2024 23:00 - 24:00 | 0 | 0 | 0 | 0 |
| 19.05.2024 00:00 - 01:00 | 0 | 0 | 0 | 0 |
| 19.05.2024 01:00 - 02:00 | 0 | 0 | 0 | 0 |
| 19.05.2024 02:00 - 03:00 | 0 | 0 | 0 | 0 |
| 19.05.2024 03:00 - 04:00 | 0 | 0 | 0 | 0 |
| 19.05.2024 04:00 - 05:00 | 0 | 0 | 0 | 0 |
| 19.05.2024 05:00 - 06:00 | 0 | 0 | 0 | 0 |
| 19.05.2024 06:00 - 07:00 | 0 | 0 | 0 | 0 |
| 19.05.2024 07:00 - 08:00 | 0 | 0 | 0 | 0 |
| 19.05.2024 08:00 - 09:00 | 0 | 0 | 0 | 0 |
| 19.05.2024 09:00 - 10:00 | 0 | 0 | 0 | 0 |
| 19.05.2024 10:00 - 11:00 | 0 | 0 | 0 | 0 |
| 19.05.2024 11:00 - 12:00 | 0 | 0 | 0 | 0 |
| 19.05.2024 12:00 - 13:00 | 0 | 0 | 0 | 0 |
| 19.05.2024 13:00 - 14:00 | 0 | 0 | 0 | 0 |
| 19.05.2024 14:00 - 15:00 | 0 | 0 | 0 | 0 |
| 19.05.2024 15:00 - 16:00 | 0 | 0 | 0 | 0 |
| 19.05.2024 16:00 - 17:00 | 0 | 0 | 0 | 0 |
| 19.05.2024 17:00 - 18:00 | 0 | 0 | 0 | 0 |
| 19.05.2024 18:00 - 19:00 | 0 | 0 | 0 | 0 |
| 19.05.2024 19:00 - 20:00 | 0 | 0 | 0 | 0 |
| 19.05.2024 20:00 - 21:00 | 0 | 0 | 0 | 0 |
| 19.05.2024 21:00 - 22:00 | 0 | 0 | 0 | 0 |
| 19.05.2024 22:00 - 23:00 | 0 | 0 | 0 | 0 |
| 19.05.2024 23:00 - 24:00 | 0 | 0 | 0 | 0 |
| 20.05.2024 00:00 - 01:00 | 0 | 0 | 0 | 0 |
| 20.05.2024 01:00 - 02:00 | 0 | 0 | 0 | 0 |
| 20.05.2024 02:00 - 03:00 | 0 | 0 | 0 | 0 |
| 20.05.2024 03:00 - 04:00 | 0 | 0 | 0 | 0 |
| 20.05.2024 04:00 - 05:00 | 0 | 0 | 0 | 0 |
| 20.05.2024 05:00 - 06:00 | 0 | 0 | 0 | 0 |
| 20.05.2024 06:00 - 07:00 | 0 | 0 | 0 | 0 |
| 20.05.2024 07:00 - 08:00 | 0 | 0 | 0 | 0 |
| 20.05.2024 08:00 - 09:00 | 0 | 0 | 0 | 0 |
| 20.05.2024 09:00 - 10:00 | 0 | 0 | 0 | 0 |
| 20.05.2024 10:00 - 11:00 | 0 | 0 | 0 | 0 |
| 20.05.2024 11:00 - 12:00 | 0 | 0 | 0 | 0 |
| 20.05.2024 12:00 - 13:00 | 0 | 0 | 0 | 0 |
| 20.05.2024 13:00 - 14:00 | 0 | 0 | 0 | 0 |
| 20.05.2024 14:00 - 15:00 | 0 | 0 | 0 | 0 |
| 20.05.2024 15:00 - 16:00 | 0 | 0 | 0 | 0 |
| 20.05.2024 16:00 - 17:00 | 0 | 0 | 0 | 0 |
| 20.05.2024 17:00 - 18:00 | 0 | 0 | 0 | 0 |
| 20.05.2024 18:00 - 19:00 | 0 | 0 | 0 | 0 |
| 20.05.2024 19:00 - 20:00 | 0 | 0 | 0 | 0 |
| 20.05.2024 20:00 - 21:00 | 0 | 0 | 0 | 0 |
| 20.05.2024 21:00 - 22:00 | 0 | 0 | 0 | 0 |
| 20.05.2024 22:00 - 23:00 | 0 | 0 | 0 | 0 |
| 20.05.2024 23:00 - 24:00 | 0 | 0 | 0 | 0 |
| 21.05.2024 00:00 - 01:00 | 0 | 0 | 0 | 0 |
| 21.05.2024 01:00 - 02:00 | 0 | 0 | 0 | 0 |
| 21.05.2024 02:00 - 03:00 | 0 | 0 | 0 | 0 |
| 21.05.2024 03:00 - 04:00 | 0 | 0 | 0 | 0 |
| 21.05.2024 04:00 - 05:00 | 0 | 0 | 0 | 0 |
| 21.05.2024 05:00 - 06:00 | 0 | -800 | 0 | 0 |
| 21.05.2024 06:00 - 07:00 | 0 | 0 | 0 | 0 |
| 21.05.2024 07:00 - 08:00 | 0 | 0 | 0 | 0 |
| 21.05.2024 08:00 - 09:00 | 0 | 0 | 0 | 0 |
| 21.05.2024 09:00 - 10:00 | 0 | 0 | 0 | 0 |
| 21.05.2024 10:00 - 11:00 | 0 | 0 | 0 | 0 |
| 21.05.2024 11:00 - 12:00 | 0 | 0 | 0 | 0 |
| 21.05.2024 12:00 - 13:00 | 0 | 0 | 0 | 0 |
| 21.05.2024 13:00 - 14:00 | 0 | 0 | 0 | 0 |
| 21.05.2024 14:00 - 15:00 | 0 | -200 | 0 | 0 |
| 21.05.2024 15:00 - 16:00 | 0 | -400 | 0 | 0 |
| 21.05.2024 16:00 - 17:00 | 0 | -400 | 0 | 0 |
| 21.05.2024 17:00 - 18:00 | 0 | -400 | 0 | 0 |
| 21.05.2024 18:00 - 19:00 | 0 | -1200 | 0 | 0 |
| 21.05.2024 19:00 - 20:00 | 0 | -1200 | 0 | 0 |
| 21.05.2024 20:00 - 21:00 | 0 | -1200 | 0 | 0 |
| 21.05.2024 21:00 - 22:00 | 0 | -1200 | 0 | 0 |
| 21.05.2024 22:00 - 23:00 | 0 | -1200 | 0 | 0 |
| 21.05.2024 23:00 - 24:00 | 0 | -1200 | 0 | 0 |
| 22.05.2024 00:00 - 01:00 | 0 | -1200 | 0 | 0 |
| 22.05.2024 01:00 - 02:00 | 0 | -1200 | 0 | 0 |
| 22.05.2024 02:00 - 03:00 | 0 | -1200 | 0 | 0 |
| 22.05.2024 03:00 - 04:00 | 0 | -1200 | 0 | 0 |
| 22.05.2024 04:00 - 05:00 | 0 | -1200 | 0 | 0 |
| 22.05.2024 05:00 - 06:00 | 0 | -1200 | 0 | 0 |
| 22.05.2024 06:00 - 07:00 | 0 | 0 | 0 | 0 |
| 22.05.2024 07:00 - 08:00 | 0 | 0 | 0 | 0 |
| 22.05.2024 08:00 - 09:00 | 0 | 0 | 0 | 0 |
| 22.05.2024 09:00 - 10:00 | 0 | 0 | 0 | 0 |
| 22.05.2024 10:00 - 11:00 | 0 | 0 | 0 | 0 |
| 22.05.2024 11:00 - 12:00 | 0 | 0 | 0 | 0 |
| 22.05.2024 12:00 - 13:00 | 0 | -500 | 0 | 0 |
| 22.05.2024 13:00 - 14:00 | 0 | -500 | 0 | 0 |
| 22.05.2024 14:00 - 15:00 | 0 | -500 | 0 | 0 |
| 22.05.2024 15:00 - 16:00 | 0 | -500 | 0 | 0 |
| 22.05.2024 16:00 - 17:00 | 0 | -500 | 0 | 0 |
| 22.05.2024 17:00 - 18:00 | 0 | -500 | 0 | 0 |
| 22.05.2024 18:00 - 19:00 | 0 | -500 | 0 | 0 |
| 22.05.2024 19:00 - 20:00 | 0 | -500 | 0 | 0 |
| 22.05.2024 20:00 - 21:00 | 0 | -500 | 0 | 0 |
| 22.05.2024 21:00 - 22:00 | 0 | -500 | 0 | 0 |
| 22.05.2024 22:00 - 23:00 | 0 | -500 | 0 | 0 |
| 22.05.2024 23:00 - 24:00 | 0 | -500 | 0 | 0 |
| 23.05.2024 00:00 - 01:00 | 0 | -500 | 0 | 0 |
| 23.05.2024 01:00 - 02:00 | 0 | -500 | 0 | 0 |
| 23.05.2024 02:00 - 03:00 | 0 | -500 | 0 | 0 |
| 23.05.2024 03:00 - 04:00 | 0 | -500 | 0 | 0 |
| 23.05.2024 04:00 - 05:00 | 0 | -500 | 0 | 0 |
| 23.05.2024 05:00 - 06:00 | 0 | -500 | 0 | 0 |
| 23.05.2024 06:00 - 07:00 | 0 | 0 | 0 | 0 |
| 23.05.2024 07:00 - 08:00 | 0 | 0 | 0 | 0 |
| 23.05.2024 08:00 - 09:00 | 0 | 0 | 0 | 0 |
| 23.05.2024 09:00 - 10:00 | 0 | 0 | 0 | 0 |
| 23.05.2024 10:00 - 11:00 | 0 | 0 | 0 | 0 |
| 23.05.2024 11:00 - 12:00 | 0 | 0 | 0 | 0 |
| 23.05.2024 12:00 - 13:00 | 0 | 0 | 0 | 0 |
| 23.05.2024 13:00 - 14:00 | 0 | 0 | 0 | 0 |
| 23.05.2024 14:00 - 15:00 | 0 | 0 | 0 | 0 |
| 23.05.2024 15:00 - 16:00 | 0 | 0 | 0 | 0 |
| 23.05.2024 16:00 - 17:00 | 0 | 0 | 0 | 0 |
| 23.05.2024 17:00 - 18:00 | 0 | 0 | 0 | 0 |
| 23.05.2024 18:00 - 19:00 | 0 | 0 | 0 | 0 |
| 23.05.2024 19:00 - 20:00 | 0 | 0 | 0 | 0 |
| 23.05.2024 20:00 - 21:00 | 0 | 0 | 0 | 0 |
| 23.05.2024 21:00 - 22:00 | 0 | 0 | 0 | 0 |
| 23.05.2024 22:00 - 23:00 | 0 | 0 | 0 | 0 |
| 23.05.2024 23:00 - 24:00 | 0 | 0 | 0 | 0 |
| 24.05.2024 00:00 - 01:00 | 0 | 0 | 0 | 0 |
| 24.05.2024 01:00 - 02:00 | 0 | 0 | 0 | 0 |
| 24.05.2024 02:00 - 03:00 | 0 | 0 | 0 | 0 |
| 24.05.2024 03:00 - 04:00 | 0 | 0 | 0 | 0 |
| 24.05.2024 04:00 - 05:00 | 0 | 0 | 0 | 0 |
| 24.05.2024 05:00 - 06:00 | 0 | 0 | 0 | 0 |
| 24.05.2024 06:00 - 07:00 | 0 | 0 | 0 | 0 |
| 24.05.2024 07:00 - 08:00 | 0 | 0 | 0 | 0 |
| 24.05.2024 08:00 - 09:00 | 0 | 0 | 0 | 0 |
| 24.05.2024 09:00 - 10:00 | 0 | 0 | 0 | 0 |
| 24.05.2024 10:00 - 11:00 | 0 | 0 | 0 | 0 |
| 24.05.2024 11:00 - 12:00 | 0 | 0 | 0 | 0 |
| 24.05.2024 12:00 - 13:00 | 0 | 0 | 0 | 0 |
| 24.05.2024 13:00 - 14:00 | 0 | 0 | 0 | 0 |
| 24.05.2024 14:00 - 15:00 | 0 | 0 | 0 | 0 |
| 24.05.2024 15:00 - 16:00 | 0 | 0 | 0 | 0 |
| 24.05.2024 16:00 - 17:00 | 0 | 0 | 0 | 0 |
| 24.05.2024 17:00 - 18:00 | 0 | 0 | 0 | 0 |
| 24.05.2024 18:00 - 19:00 | 0 | 0 | 0 | 0 |
| 24.05.2024 19:00 - 20:00 | 0 | 0 | 0 | 0 |
| 24.05.2024 20:00 - 21:00 | 0 | 0 | 0 | 0 |
| 24.05.2024 21:00 - 22:00 | 0 | 0 | 0 | 0 |
| 24.05.2024 22:00 - 23:00 | 0 | 0 | 0 | 0 |
| 24.05.2024 23:00 - 24:00 | 0 | 0 | 0 | 0 |
| 25.05.2024 00:00 - 01:00 | 0 | 0 | 0 | 0 |
| 25.05.2024 01:00 - 02:00 | 0 | 0 | 0 | 0 |
| 25.05.2024 02:00 - 03:00 | 0 | 0 | 0 | 0 |
| 25.05.2024 03:00 - 04:00 | 0 | 0 | 0 | 0 |
| 25.05.2024 04:00 - 05:00 | 0 | 0 | 0 | 0 |
| 25.05.2024 05:00 - 06:00 | 0 | 0 | 0 | 0 |
| 25.05.2024 06:00 - 07:00 | 0 | 0 | 0 | 0 |
| 25.05.2024 07:00 - 08:00 | 0 | 0 | 0 | 0 |
| 25.05.2024 08:00 - 09:00 | 0 | 0 | 0 | 0 |
| 25.05.2024 09:00 - 10:00 | 0 | 0 | 0 | 0 |
| 25.05.2024 10:00 - 11:00 | 0 | 0 | 0 | 0 |
| 25.05.2024 11:00 - 12:00 | 0 | 0 | 0 | 0 |
| 25.05.2024 12:00 - 13:00 | 0 | 0 | 0 | 0 |
| 25.05.2024 13:00 - 14:00 | 0 | 0 | 0 | 0 |
| 25.05.2024 14:00 - 15:00 | 0 | 0 | 0 | 0 |
| 25.05.2024 15:00 - 16:00 | 0 | 0 | 0 | 0 |
| 25.05.2024 16:00 - 17:00 | 0 | 0 | 0 | 0 |
| 25.05.2024 17:00 - 18:00 | 0 | 0 | 0 | 0 |
| 25.05.2024 18:00 - 19:00 | 0 | 0 | 0 | 0 |
| 25.05.2024 19:00 - 20:00 | 0 | 0 | 0 | 0 |
| 25.05.2024 20:00 - 21:00 | 0 | 0 | 0 | 0 |
| 25.05.2024 21:00 - 22:00 | 0 | 0 | 0 | 0 |
| 25.05.2024 22:00 - 23:00 | 0 | 0 | 0 | 0 |
| 25.05.2024 23:00 - 24:00 | 0 | 0 | 0 | 0 |
| 26.05.2024 00:00 - 01:00 | 0 | 0 | 0 | 0 |
| 26.05.2024 01:00 - 02:00 | 0 | 0 | 0 | 0 |
| 26.05.2024 02:00 - 03:00 | 0 | 0 | 0 | 0 |
| 26.05.2024 03:00 - 04:00 | 0 | 0 | 0 | 0 |
| 26.05.2024 04:00 - 05:00 | 0 | 0 | 0 | 0 |
| 26.05.2024 05:00 - 06:00 | 0 | 0 | 0 | 0 |
| 26.05.2024 06:00 - 07:00 | 0 | 0 | 0 | 0 |
| 26.05.2024 07:00 - 08:00 | 0 | 0 | 0 | 0 |
| 26.05.2024 08:00 - 09:00 | 0 | 0 | 0 | 0 |
| 26.05.2024 09:00 - 10:00 | 0 | 0 | 0 | 0 |
| 26.05.2024 10:00 - 11:00 | 0 | 0 | 0 | 0 |
| 26.05.2024 11:00 - 12:00 | 0 | 0 | 0 | 0 |
| 26.05.2024 12:00 - 13:00 | 0 | 0 | 0 | 0 |
| 26.05.2024 13:00 - 14:00 | 0 | 0 | 0 | 0 |
| 26.05.2024 14:00 - 15:00 | 0 | 0 | 0 | 0 |
| 26.05.2024 15:00 - 16:00 | 0 | 0 | 0 | 0 |
| 26.05.2024 16:00 - 17:00 | 0 | 0 | 0 | 0 |
| 26.05.2024 17:00 - 18:00 | 0 | 0 | 0 | 0 |
| 26.05.2024 18:00 - 19:00 | 0 | 0 | 0 | 0 |
| 26.05.2024 19:00 - 20:00 | 0 | 0 | 0 | 0 |
| 26.05.2024 20:00 - 21:00 | 0 | 0 | 0 | 0 |
| 26.05.2024 21:00 - 22:00 | 0 | 0 | 0 | 0 |
| 26.05.2024 22:00 - 23:00 | 0 | 0 | 0 | 0 |
| 26.05.2024 23:00 - 24:00 | 0 | 0 | 0 | 0 |
| 27.05.2024 00:00 - 01:00 | 0 | 0 | 0 | 0 |
| 27.05.2024 01:00 - 02:00 | 0 | 0 | 0 | 0 |
| 27.05.2024 02:00 - 03:00 | 0 | 0 | 0 | 0 |
| 27.05.2024 03:00 - 04:00 | 0 | 0 | 0 | 0 |
| 27.05.2024 04:00 - 05:00 | 0 | 0 | 0 | 0 |
| 27.05.2024 05:00 - 06:00 | 0 | 0 | 0 | 0 |
| 27.05.2024 06:00 - 07:00 | 0 | 0 | 0 | 0 |
| 27.05.2024 07:00 - 08:00 | 0 | 0 | 0 | 0 |
| 27.05.2024 08:00 - 09:00 | 0 | 0 | 0 | 0 |
| 27.05.2024 09:00 - 10:00 | 0 | 0 | 0 | 0 |
| 27.05.2024 10:00 - 11:00 | 0 | 0 | 0 | 0 |
| 27.05.2024 11:00 - 12:00 | 0 | 0 | 0 | 0 |
| 27.05.2024 12:00 - 13:00 | 0 | 0 | 0 | 0 |
| 27.05.2024 13:00 - 14:00 | 0 | 0 | 0 | 0 |
| 27.05.2024 14:00 - 15:00 | 0 | 0 | 0 | 0 |
| 27.05.2024 15:00 - 16:00 | 0 | 0 | 0 | 0 |
| 27.05.2024 16:00 - 17:00 | 0 | 0 | 0 | 0 |
| 27.05.2024 17:00 - 18:00 | 0 | 0 | 0 | 0 |
| 27.05.2024 18:00 - 19:00 | 0 | 0 | 0 | 0 |
| 27.05.2024 19:00 - 20:00 | 0 | 0 | 0 | 0 |
| 27.05.2024 20:00 - 21:00 | 0 | 0 | 0 | 0 |
| 27.05.2024 21:00 - 22:00 | 0 | 0 | 0 | 0 |
| 27.05.2024 22:00 - 23:00 | 0 | 0 | 0 | 0 |
| 27.05.2024 23:00 - 24:00 | 0 | 0 | 0 | 0 |
| 28.05.2024 00:00 - 01:00 | 0 | -500 | 0 | 0 |
| 28.05.2024 01:00 - 02:00 | 0 | -500 | 0 | 0 |
| 28.05.2024 02:00 - 03:00 | 0 | -1503 | 0 | 0 |
| 28.05.2024 03:00 - 04:00 | 0 | -2503 | 0 | 0 |
| 28.05.2024 04:00 - 05:00 | 0 | -2503 | 0 | 0 |
| 28.05.2024 05:00 - 06:00 | 0 | -2503 | 0 | 0 |
| 28.05.2024 06:00 - 07:00 | 0 | 0 | 0 | 0 |
| 28.05.2024 07:00 - 08:00 | 0 | 0 | 0 | 0 |
| 28.05.2024 08:00 - 09:00 | 0 | 0 | 0 | 0 |
| 28.05.2024 09:00 - 10:00 | 0 | 0 | 0 | 0 |
| 28.05.2024 10:00 - 11:00 | 0 | 0 | 0 | 0 |
| 28.05.2024 11:00 - 12:00 | 0 | 0 | 0 | 0 |
| 28.05.2024 12:00 - 13:00 | 0 | 0 | 0 | 0 |
| 28.05.2024 13:00 - 14:00 | 0 | 0 | 0 | 0 |
| 28.05.2024 14:00 - 15:00 | 0 | 0 | 0 | 0 |
| 28.05.2024 15:00 - 16:00 | 400 | 0 | 0 | 0 |
| 28.05.2024 16:00 - 17:00 | 400 | 0 | 0 | 0 |
| 28.05.2024 17:00 - 18:00 | 400 | 0 | 0 | 0 |
| 28.05.2024 18:00 - 19:00 | 400 | 0 | 0 | 0 |
| 28.05.2024 19:00 - 20:00 | 400 | 0 | 0 | 0 |
| 28.05.2024 20:00 - 21:00 | 400 | 0 | 0 | 0 |
| 28.05.2024 21:00 - 22:00 | 400 | 0 | 0 | 0 |
| 28.05.2024 22:00 - 23:00 | 400 | 0 | 0 | 0 |
| 28.05.2024 23:00 - 24:00 | 400 | 0 | 0 | 0 |
| 29.05.2024 00:00 - 01:00 | 400 | 0 | 0 | 0 |
| 29.05.2024 01:00 - 02:00 | 400 | 0 | 0 | 0 |
| 29.05.2024 02:00 - 03:00 | 400 | 0 | 0 | 0 |
| 29.05.2024 03:00 - 04:00 | 400 | 0 | 0 | 0 |
| 29.05.2024 04:00 - 05:00 | 400 | 0 | 0 | 0 |
| 29.05.2024 05:00 - 06:00 | 400 | 0 | 0 | 0 |
| 29.05.2024 06:00 - 07:00 | 0 | 0 | 0 | 0 |
| 29.05.2024 07:00 - 08:00 | 0 | 0 | 0 | 0 |
| 29.05.2024 08:00 - 09:00 | 0 | 0 | 0 | 0 |
| 29.05.2024 09:00 - 10:00 | 0 | 0 | 0 | 0 |
| 29.05.2024 10:00 - 11:00 | 0 | 0 | 0 | 0 |
| 29.05.2024 11:00 - 12:00 | 0 | 0 | 0 | 0 |
| 29.05.2024 12:00 - 13:00 | 0 | 0 | 0 | 0 |
| 29.05.2024 13:00 - 14:00 | 0 | 0 | 0 | 0 |
| 29.05.2024 14:00 - 15:00 | 0 | 0 | 0 | 0 |
| 29.05.2024 15:00 - 16:00 | 0 | 0 | 0 | 0 |
| 29.05.2024 16:00 - 17:00 | 0 | 0 | 0 | 0 |
| 29.05.2024 17:00 - 18:00 | 0 | 0 | 0 | 0 |
| 29.05.2024 18:00 - 19:00 | 0 | 0 | 0 | 0 |
| 29.05.2024 19:00 - 20:00 | 0 | 0 | 0 | 0 |
| 29.05.2024 20:00 - 21:00 | 0 | 0 | 0 | 0 |
| 29.05.2024 21:00 - 22:00 | 0 | 0 | 0 | 0 |
| 29.05.2024 22:00 - 23:00 | 0 | 0 | 0 | 0 |
| 29.05.2024 23:00 - 24:00 | 0 | 0 | 0 | 0 |
| 30.05.2024 00:00 - 01:00 | 0 | 0 | 0 | 0 |
| 30.05.2024 01:00 - 02:00 | 0 | 0 | 0 | 0 |
| 30.05.2024 02:00 - 03:00 | 0 | 0 | 0 | 0 |
| 30.05.2024 03:00 - 04:00 | 0 | 0 | 0 | 0 |
| 30.05.2024 04:00 - 05:00 | 0 | 0 | 0 | 0 |
| 30.05.2024 05:00 - 06:00 | 0 | 0 | 0 | 0 |
| 30.05.2024 06:00 - 07:00 | 0 | 0 | 0 | 0 |
| 30.05.2024 07:00 - 08:00 | 0 | 0 | 0 | 0 |
| 30.05.2024 08:00 - 09:00 | 0 | 0 | 0 | 0 |
| 30.05.2024 09:00 - 10:00 | 0 | 0 | 0 | 0 |
| 30.05.2024 10:00 - 11:00 | 0 | 0 | 0 | 0 |
| 30.05.2024 11:00 - 12:00 | 0 | 0 | 0 | 0 |
| 30.05.2024 12:00 - 13:00 | 0 | 0 | 0 | 0 |
| 30.05.2024 13:00 - 14:00 | 0 | 0 | 0 | 0 |
| 30.05.2024 14:00 - 15:00 | 0 | 0 | 0 | 0 |
| 30.05.2024 15:00 - 16:00 | 0 | 0 | 0 | 0 |
| 30.05.2024 16:00 - 17:00 | 0 | 0 | 0 | 0 |
| 30.05.2024 17:00 - 18:00 | 0 | 0 | 0 | 0 |
| 30.05.2024 18:00 - 19:00 | 0 | 0 | 0 | 0 |
| 30.05.2024 19:00 - 20:00 | 0 | 0 | 0 | 0 |
| 30.05.2024 20:00 - 21:00 | 0 | 0 | 0 | 0 |
| 30.05.2024 21:00 - 22:00 | 0 | 0 | 0 | 0 |
| 30.05.2024 22:00 - 23:00 | 0 | 0 | 0 | 0 |
| 30.05.2024 23:00 - 24:00 | 0 | 0 | 0 | 0 |
| 31.05.2024 00:00 - 01:00 | 0 | 0 | 0 | 0 |
| 31.05.2024 01:00 - 02:00 | 0 | 0 | 0 | 0 |
| 31.05.2024 02:00 - 03:00 | 0 | 0 | 0 | 0 |
| 31.05.2024 03:00 - 04:00 | 0 | -700 | 0 | 0 |
| 31.05.2024 04:00 - 05:00 | 0 | -700 | 0 | 0 |
| 31.05.2024 05:00 - 06:00 | 0 | -700 | 0 | 0 |